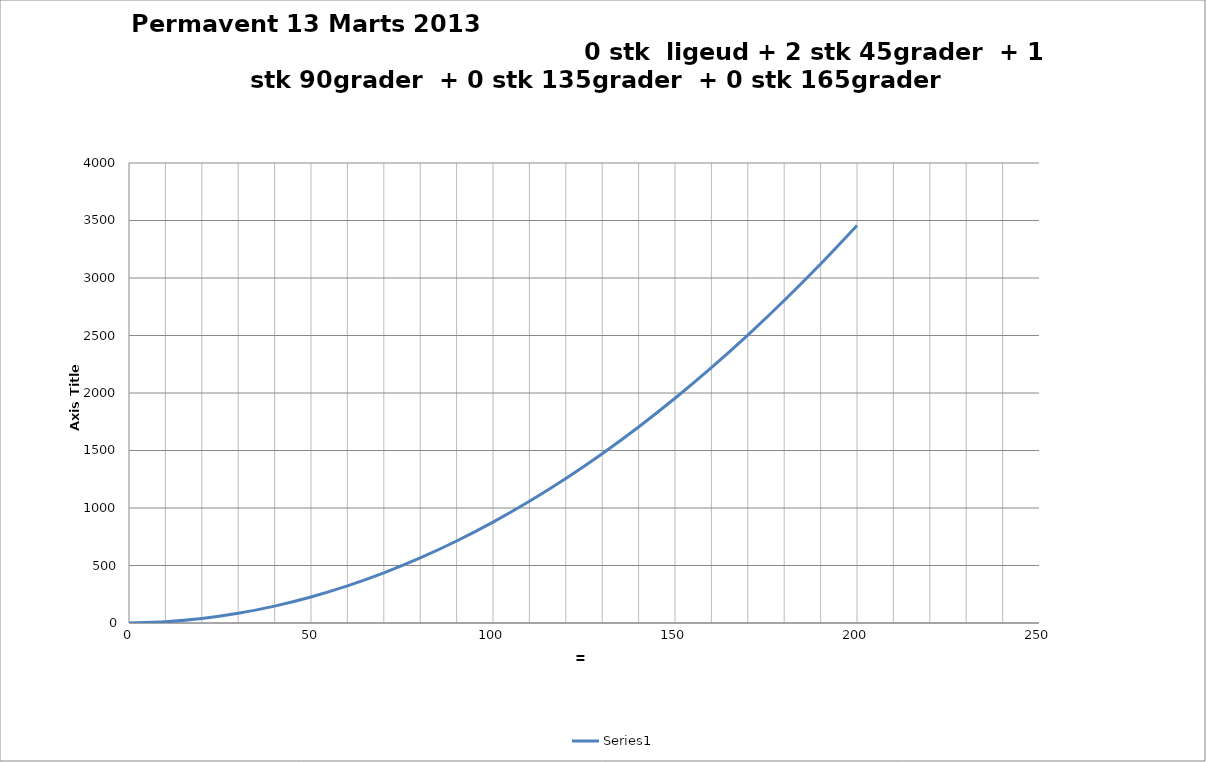
| Category | Series 0 |
|---|---|
| 0.0 | 0 |
| 10.0 | 11.215 |
| 20.0 | 39.438 |
| 30.0 | 84.669 |
| 40.0 | 146.909 |
| 50.0 | 226.158 |
| 60.0 | 322.414 |
| 70.0 | 435.679 |
| 80.0 | 565.953 |
| 90.0 | 713.235 |
| 100.0 | 877.525 |
| 110.0 | 1058.824 |
| 120.0 | 1257.131 |
| 130.0 | 1472.446 |
| 140.0 | 1704.77 |
| 150.0 | 1954.102 |
| 160.0 | 2220.443 |
| 170.0 | 2503.792 |
| 180.0 | 2804.149 |
| 190.0 | 3121.515 |
| 200.0 | 3455.889 |